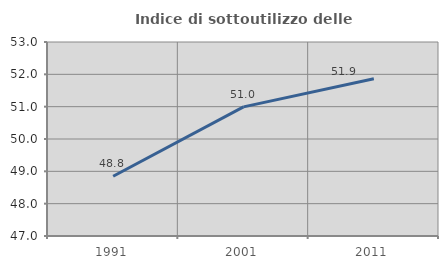
| Category | Indice di sottoutilizzo delle abitazioni  |
|---|---|
| 1991.0 | 48.847 |
| 2001.0 | 50.993 |
| 2011.0 | 51.864 |